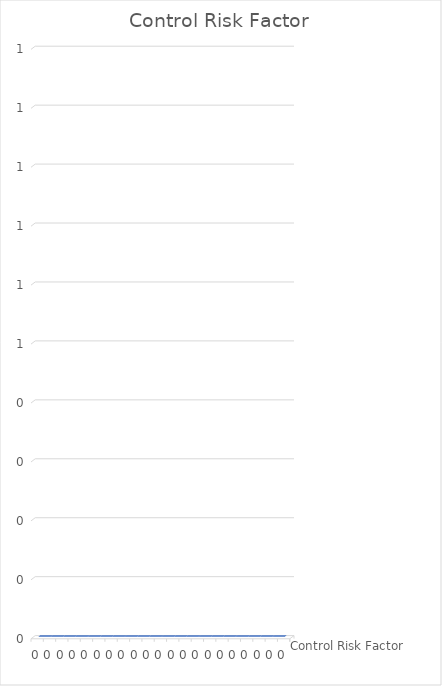
| Category | Control Risk Factor |
|---|---|
| 0.0 | 0 |
| 0.0 | 0 |
| 0.0 | 0 |
| 0.0 | 0 |
| 0.0 | 0 |
| 0.0 | 0 |
| 0.0 | 0 |
| 0.0 | 0 |
| 0.0 | 0 |
| 0.0 | 0 |
| 0.0 | 0 |
| 0.0 | 0 |
| 0.0 | 0 |
| 0.0 | 0 |
| 0.0 | 0 |
| 0.0 | 0 |
| 0.0 | 0 |
| 0.0 | 0 |
| 0.0 | 0 |
| 0.0 | 0 |
| 0.0 | 0 |